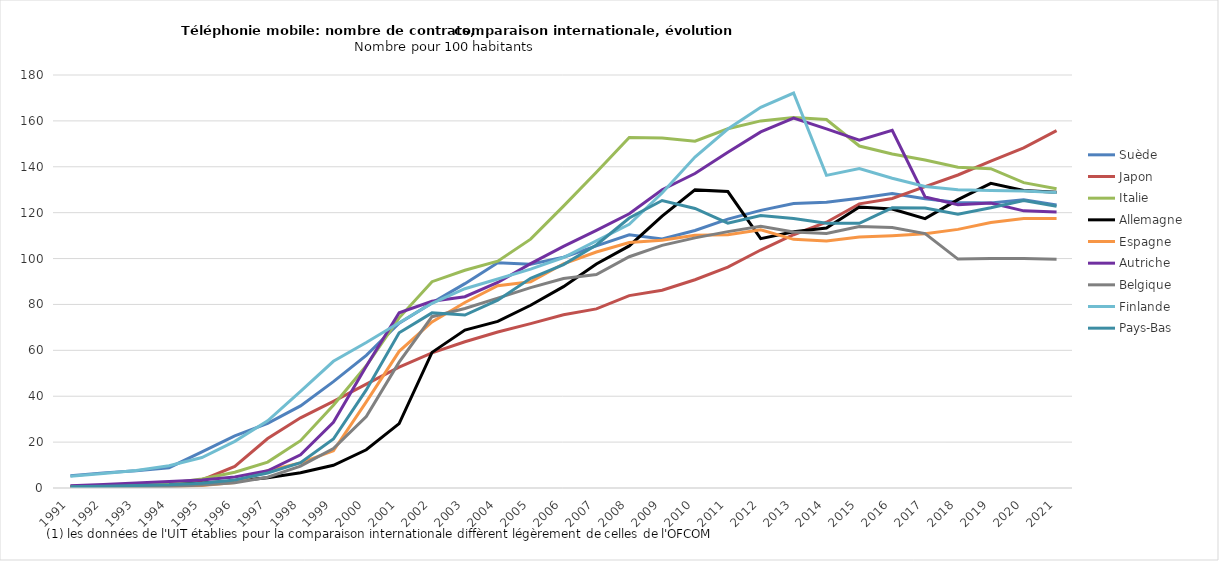
| Category | Suède | Japon | Italie | Allemagne | Espagne | Autriche | Belgique | Finlande | Pays-Bas |
|---|---|---|---|---|---|---|---|---|---|
| 1991 | 5.388 | 0.71 | 0.468 | 0 | 0.141 | 0.961 | 0.43 | 5.171 | 0.531 |
| 1992 | 6.594 | 1.123 | 0.999 | 0.339 | 0.278 | 1.494 | 0.514 | 6.371 | 0.767 |
| 1993 | 7.56 | 1.39 | 1.376 | 0.657 | 0.461 | 2.212 | 0.612 | 7.667 | 1.099 |
| 1994 | 8.864 | 1.724 | 2.12 | 1.191 | 0.656 | 2.805 | 0.672 | 9.665 | 1.42 |
| 1995 | 15.713 | 3.49 | 3.932 | 2.158 | 1.048 | 3.505 | 1.264 | 13.282 | 2.096 |
| 1996 | 22.749 | 9.409 | 6.886 | 3.01 | 2.397 | 4.803 | 2.315 | 20.342 | 3.495 |
| 1997 | 28.16 | 21.561 | 11.279 | 4.48 | 7.586 | 7.475 | 4.694 | 29.302 | 6.549 |
| 1998 | 35.771 | 30.591 | 20.634 | 6.61 | 10.953 | 14.471 | 9.548 | 42.067 | 11.004 |
| 1999 | 46.371 | 37.765 | 36.04 | 9.912 | 16.203 | 28.629 | 17.18 | 55.227 | 21.36 |
| 2000 | 57.832 | 45.302 | 53.27 | 16.662 | 37.561 | 53.078 | 31.112 | 63.38 | 42.767 |
| 2001 | 71.833 | 52.667 | 74.16 | 28.082 | 59.558 | 76.363 | 54.84 | 72.034 | 67.645 |
| 2002 | 80.681 | 58.882 | 89.913 | 59.106 | 72.39 | 81.36 | 74.661 | 80.485 | 76.338 |
| 2003 | 89.054 | 63.721 | 94.909 | 68.854 | 80.841 | 83.377 | 78.236 | 86.851 | 75.356 |
| 2004 | 98.209 | 67.963 | 98.859 | 72.6 | 88.135 | 89.58 | 82.728 | 91.063 | 81.847 |
| 2005 | 97.565 | 71.648 | 108.45 | 79.659 | 89.904 | 97.807 | 87.333 | 95.407 | 91.38 |
| 2006 | 100.577 | 75.497 | 122.852 | 87.763 | 97.731 | 105.323 | 91.326 | 100.456 | 97.369 |
| 2007 | 105.517 | 78.049 | 137.632 | 97.61 | 102.864 | 112.255 | 93.049 | 107.667 | 105.944 |
| 2008 | 110.394 | 83.854 | 152.779 | 105.512 | 107.021 | 119.498 | 100.792 | 114.962 | 117.654 |
| 2009 | 108.503 | 86.194 | 152.541 | 118.537 | 107.955 | 129.982 | 105.733 | 128.544 | 125.31 |
| 2010 | 112.241 | 90.773 | 151.156 | 129.927 | 110.104 | 137.05 | 109.016 | 144.227 | 121.848 |
| 2011 | 117.168 | 96.239 | 156.573 | 129.214 | 110.342 | 146.374 | 111.731 | 156.434 | 115.417 |
| 2012 | 120.986 | 103.714 | 159.999 | 108.7 | 112.543 | 155.193 | 114.058 | 165.919 | 118.728 |
| 2013 | 123.99 | 110.383 | 161.469 | 111.639 | 108.36 | 161.193 | 111.624 | 172.151 | 117.466 |
| 2014 | 124.515 | 115.828 | 160.602 | 113.311 | 107.629 | 156.518 | 110.915 | 136.264 | 115.412 |
| 2015 | 126.315 | 123.832 | 149.056 | 122.47 | 109.344 | 151.562 | 113.94 | 139.205 | 115.382 |
| 2016 | 128.321 | 126.176 | 145.587 | 121.587 | 109.986 | 155.866 | 113.565 | 134.98 | 122.111 |
| 2017 | 126.02 | 131.386 | 142.977 | 117.407 | 110.863 | 126.818 | 110.904 | 131.389 | 121.989 |
| 2018 | 124.469 | 136.418 | 139.777 | 125.675 | 112.714 | 123.433 | 99.761 | 129.989 | 119.322 |
| 2019 | 124.246 | 142.467 | 139.188 | 132.77 | 115.748 | 124.246 | 99.989 | 129.636 | 122.11 |
| 2020 | 125.594 | 148.272 | 133.071 | 129.679 | 117.448 | 120.789 | 99.991 | 129.493 | 125.334 |
| 2021 | 123.367 | 155.739 | 130.387 | 128.927 | 117.49 | 120.316 | 99.723 | 128.765 | 122.831 |